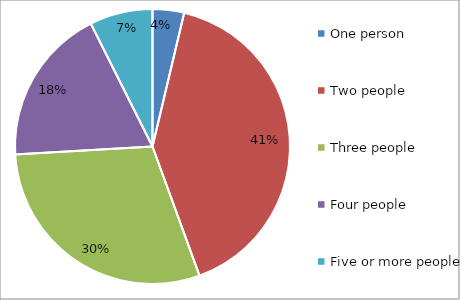
| Category | Series 0 |
|---|---|
| One person | 1 |
| Two people | 11 |
| Three people | 8 |
| Four people | 5 |
| Five or more people | 2 |